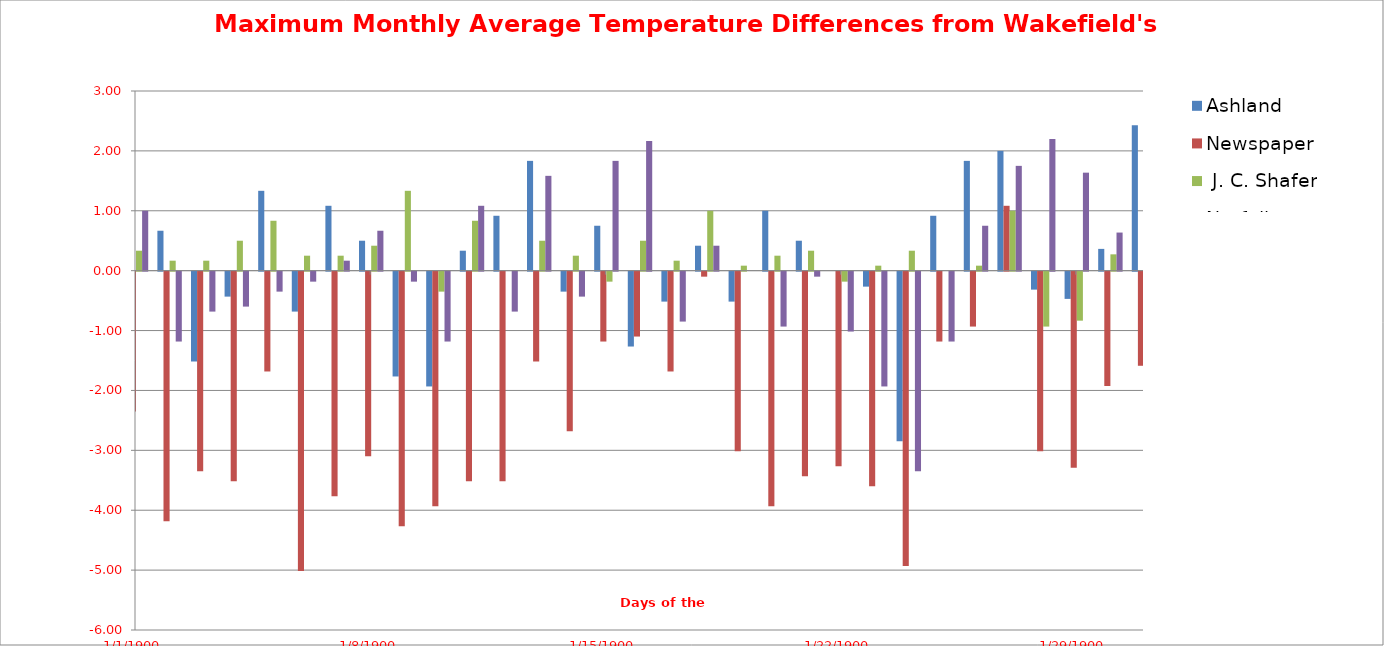
| Category | Ashland  | Newspaper |  J. C. Shafer | Norfolk   |
|---|---|---|---|---|
| 0 | -0.167 | -2.333 | 0.333 | 1 |
| 1 | 0.667 | -4.167 | 0.167 | -1.167 |
| 2 | -1.5 | -3.333 | 0.167 | -0.667 |
| 3 | -0.417 | -3.5 | 0.5 | -0.583 |
| 4 | 1.333 | -1.667 | 0.833 | -0.333 |
| 5 | -0.667 | -5 | 0.25 | -0.167 |
| 6 | 1.083 | -3.75 | 0.25 | 0.167 |
| 7 | 0.5 | -3.083 | 0.417 | 0.667 |
| 8 | -1.75 | -4.25 | 1.333 | -0.167 |
| 9 | -1.917 | -3.917 | -0.333 | -1.167 |
| 10 | 0.333 | -3.5 | 0.833 | 1.083 |
| 11 | 0.917 | -3.5 | 0 | -0.667 |
| 12 | 1.833 | -1.5 | 0.5 | 1.583 |
| 13 | -0.333 | -2.667 | 0.25 | -0.417 |
| 14 | 0.75 | -1.167 | -0.167 | 1.833 |
| 15 | -1.25 | -1.083 | 0.5 | 2.167 |
| 16 | -0.5 | -1.667 | 0.167 | -0.833 |
| 17 | 0.417 | -0.083 | 1 | 0.417 |
| 18 | -0.5 | -3 | 0.083 | 0 |
| 19 | 1 | -3.917 | 0.25 | -0.917 |
| 20 | 0.5 | -3.417 | 0.333 | -0.083 |
| 21 | 0 | -3.25 | -0.167 | -1 |
| 22 | -0.25 | -3.583 | 0.083 | -1.917 |
| 23 | -2.833 | -4.917 | 0.333 | -3.333 |
| 24 | 0.917 | -1.167 | 0 | -1.167 |
| 25 | 1.833 | -0.917 | 0.083 | 0.75 |
| 26 | 2 | 1.083 | 1 | 1.75 |
| 27 | -0.3 | -3 | -0.917 | 2.2 |
| 28 | -0.455 | -3.273 | -0.818 | 1.636 |
| 29 | 0.364 | -1.909 | 0.273 | 0.636 |
| 30 | 2.429 | -1.571 | 0 | 0.857 |